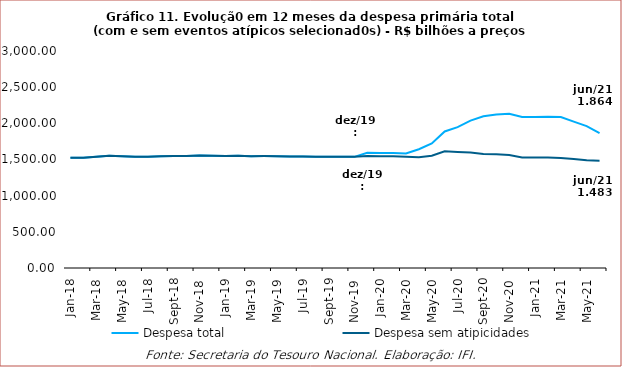
| Category | Despesa total | Despesa sem atipicidades |
|---|---|---|
| 2018-01-01 | 1523304.746 | 1523304.746 |
| 2018-02-01 | 1522641.607 | 1522641.607 |
| 2018-03-01 | 1537491.32 | 1537491.32 |
| 2018-04-01 | 1553419.263 | 1553419.263 |
| 2018-05-01 | 1544307.402 | 1544307.402 |
| 2018-06-01 | 1537601.456 | 1537601.456 |
| 2018-07-01 | 1537360.616 | 1537360.616 |
| 2018-08-01 | 1544529.346 | 1544529.346 |
| 2018-09-01 | 1546802.164 | 1546802.164 |
| 2018-10-01 | 1549844.803 | 1549844.803 |
| 2018-11-01 | 1556605.584 | 1556605.584 |
| 2018-12-01 | 1550993.602 | 1550993.602 |
| 2019-01-01 | 1548148.288 | 1548148.288 |
| 2019-02-01 | 1550766.466 | 1550766.466 |
| 2019-03-01 | 1546484.591 | 1546484.591 |
| 2019-04-01 | 1547132.753 | 1547132.753 |
| 2019-05-01 | 1545417.29 | 1545417.29 |
| 2019-06-01 | 1540363.447 | 1540363.447 |
| 2019-07-01 | 1543170.183 | 1543170.183 |
| 2019-08-01 | 1537601.816 | 1537601.816 |
| 2019-09-01 | 1537991.518 | 1537991.518 |
| 2019-10-01 | 1537965.809 | 1537965.809 |
| 2019-11-01 | 1536923.442 | 1536923.442 |
| 2019-12-01 | 1593443.155 | 1548109.728 |
| 2020-01-01 | 1589412.347 | 1544078.92 |
| 2020-02-01 | 1589954.191 | 1544620.622 |
| 2020-03-01 | 1583017.687 | 1536564.017 |
| 2020-04-01 | 1641528.33 | 1530788.507 |
| 2020-05-01 | 1720978.536 | 1552276.623 |
| 2020-06-01 | 1887103.522 | 1613499.006 |
| 2020-07-01 | 1946688.257 | 1605328.321 |
| 2020-08-01 | 2037662.605 | 1596030.645 |
| 2020-09-01 | 2096999.225 | 1576712.975 |
| 2020-10-01 | 2122960.59 | 1571977.828 |
| 2020-11-01 | 2131254.309 | 1560829.321 |
| 2020-12-01 | 2089239.677 | 1529347.017 |
| 2021-01-01 | 2088899.374 | 1526912.33 |
| 2021-02-01 | 2091704.343 | 1528628.287 |
| 2021-03-01 | 2088032.685 | 1520819.279 |
| 2021-04-01 | 2023042.756 | 1508105.37 |
| 2021-05-01 | 1961363.359 | 1488183.043 |
| 2021-06-01 | 1863928.554 | 1482906.876 |